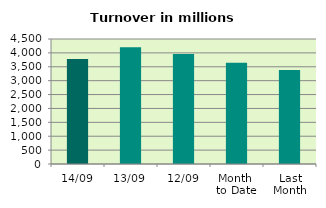
| Category | Series 0 |
|---|---|
| 14/09 | 3781.469 |
| 13/09 | 4202.797 |
| 12/09 | 3960.087 |
| Month 
to Date | 3641.21 |
| Last
Month | 3384.596 |